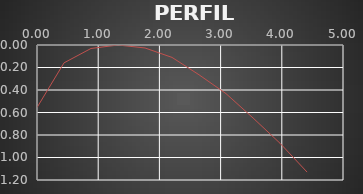
| Category | Series 0 |
|---|---|
| 0.0 | 0.556 |
| 0.44128406917265695 | 0.159 |
| 0.8825681383453139 | 0.031 |
| 1.323852207517971 | 0 |
| 1.7651362766906278 | 0.026 |
| 2.2064203458632847 | 0.11 |
| 2.6477044150359417 | 0.265 |
| 3.0889884842085986 | 0.432 |
| 3.530272553381255 | 0.649 |
| 3.971556622553912 | 0.874 |
| 4.412840691726569 | 1.13 |